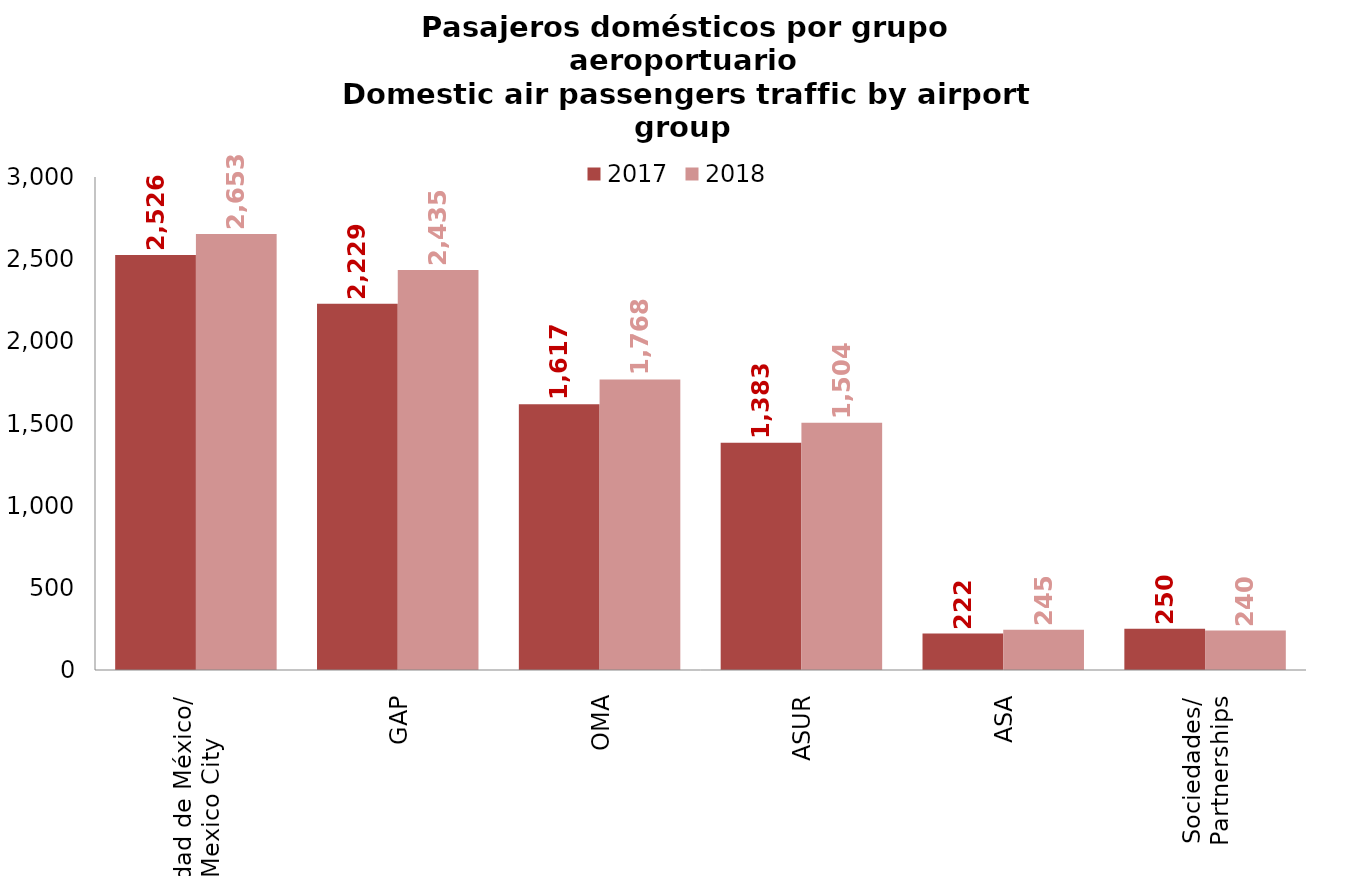
| Category | 2017 | 2018 |
|---|---|---|
| Ciudad de México/
Mexico City | 2526.005 | 2652.795 |
| GAP | 2228.611 | 2434.504 |
| OMA | 1616.645 | 1767.909 |
| ASUR | 1383.014 | 1504.479 |
| ASA | 222.054 | 245.054 |
| Sociedades/
Partnerships | 250.446 | 239.698 |